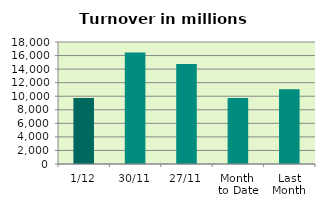
| Category | Series 0 |
|---|---|
| 1/12 | 9746.434 |
| 30/11 | 16453.193 |
| 27/11 | 14755.856 |
| Month 
to Date | 9746.434 |
| Last
Month | 11011.83 |